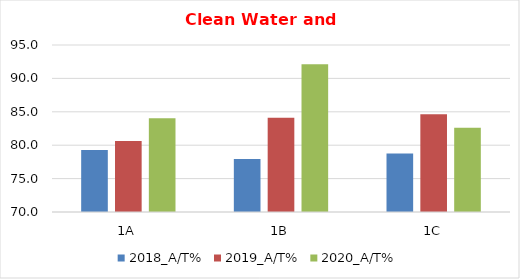
| Category | 2018_A/T% | 2019_A/T% | 2020_A/T% |
|---|---|---|---|
| 1A | 79.268 | 80.645 | 84.043 |
| 1B | 77.922 | 84.091 | 92.135 |
| 1C | 78.75 | 84.615 | 82.609 |